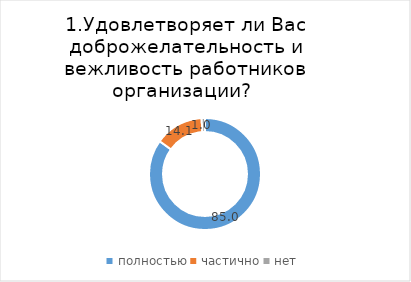
| Category | Каргасокский |
|---|---|
| полностью | 84.967 |
| частично | 14.052 |
| нет | 0.98 |